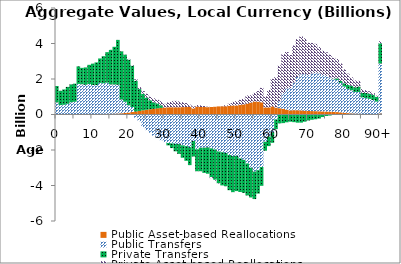
| Category | Public Asset-based Reallocations | Public Transfers | Private Transfers | Private Asset-based Reallocations |
|---|---|---|---|---|
| 0 | 21.534 | 661.137 | 924.591 | 1.373 |
|  | 21.251 | 509.418 | 806.217 | 1.067 |
| 2 | 21.518 | 525.572 | 863.68 | 1.948 |
| 3 | 21.71 | 580.158 | 953.036 | 0.537 |
| 4 | 22.199 | 668.756 | 1005.53 | -0.608 |
| 5 | 23.006 | 694.475 | 1019.086 | 0.857 |
| 6 | 24.775 | 1698.853 | 988.435 | 1.699 |
| 7 | 26.313 | 1678.239 | 923.982 | 1.572 |
| 8 | 27.889 | 1644.93 | 979.219 | 1.307 |
| 9 | 29.864 | 1687.464 | 1081.787 | 1.569 |
| 10 | 31.403 | 1629.53 | 1203.29 | 2.027 |
| 11 | 32.576 | 1622.227 | 1279.365 | 1.743 |
| 12 | 34.959 | 1744.107 | 1378.414 | 1.214 |
| 13 | 36.949 | 1723.667 | 1525.289 | 1.789 |
| 14 | 39.973 | 1750.208 | 1722.781 | 2.206 |
| 15 | 43.158 | 1649.48 | 1946.299 | 7.131 |
| 16 | 47.27 | 1643.293 | 2123.561 | -0.79 |
| 17 | 54.989 | 1618.747 | 2530.279 | 1.289 |
| 18 | 67.769 | 776.37 | 2714.487 | -10.556 |
| 19 | 86.2 | 629.948 | 2655.954 | 11.236 |
| 20 | 109.923 | 412.832 | 2572.945 | 36.077 |
| 21 | 139.126 | 282.162 | 2330.285 | 35.031 |
| 22 | 167.556 | -183.055 | 1737.439 | 78.953 |
| 23 | 199.322 | -376.253 | 1233.686 | 107.375 |
| 24 | 238.115 | -700.46 | 929.459 | 152.57 |
| 25 | 268.229 | -880.323 | 686.528 | 215.221 |
| 26 | 298.25 | -1029.943 | 499.196 | 209.603 |
| 27 | 319.861 | -1191.339 | 371.043 | 218.405 |
| 28 | 345.83 | -1329.432 | 276.843 | 202.805 |
| 29 | 370.123 | -1443.804 | 151.765 | 234.588 |
| 30 | 395.143 | -1553.788 | -1.116 | 207.496 |
| 31 | 406.623 | -1606.328 | -133.325 | 273.48 |
| 32 | 408.394 | -1632.957 | -258.574 | 343.931 |
| 33 | 408.625 | -1654.899 | -419.931 | 359.112 |
| 34 | 406.781 | -1664.095 | -554.344 | 334.778 |
| 35 | 415.903 | -1738.615 | -698.521 | 279.324 |
| 36 | 420.587 | -1781.206 | -828.258 | 224.857 |
| 37 | 430.308 | -1840.096 | -1012.002 | 124.039 |
| 38 | 344.214 | -1489.353 | -878.435 | 113.302 |
| 39 | 444.85 | -1958.298 | -1238.977 | 88.578 |
| 40 | 424.065 | -1872.649 | -1323.598 | 91.343 |
| 41 | 420.801 | -1868.884 | -1420.1 | 55.849 |
| 42 | 414.319 | -1851.398 | -1485.097 | 25.681 |
| 43 | 421.97 | -1905.202 | -1623.69 | -55.47 |
| 44 | 434.982 | -1972.049 | -1705.368 | -53.677 |
| 45 | 456.096 | -2085.197 | -1789.879 | -25.52 |
| 46 | 459.897 | -2124.636 | -1871.002 | 11.174 |
| 47 | 464.458 | -2167.608 | -1874.304 | 56.657 |
| 48 | 491.367 | -2280.564 | -1984.691 | 114.82 |
| 49 | 507.812 | -2338.024 | -2037.074 | 204.733 |
| 50 | 509.429 | -2328.3 | -1986.629 | 242.391 |
| 51 | 544.685 | -2474.061 | -1893.236 | 280.697 |
| 52 | 569.576 | -2554.784 | -1860.21 | 320.029 |
| 53 | 615.34 | -2757.915 | -1802.533 | 456.612 |
| 54 | 671.875 | -3003.235 | -1670.813 | 412.783 |
| 55 | 729.942 | -3217.867 | -1546.973 | 488.478 |
| 56 | 722.961 | -3137.615 | -1317.407 | 598.572 |
| 57 | 687.925 | -2958.751 | -1059.188 | 813.623 |
| 58 | 399.497 | -1534.628 | -506.09 | 623.853 |
| 59 | 399.36 | -1246.019 | -534.048 | 980.747 |
| 60 | 454.937 | -995.654 | -598.913 | 1554.137 |
| 61 | 388.832 | -279.517 | -542.239 | 1720.549 |
| 62 | 354.025 | 391.44 | -500.713 | 2024.469 |
| 63 | 320.197 | 886.822 | -484.409 | 2194.865 |
| 64 | 274.366 | 1200.846 | -440.144 | 2044.47 |
| 65 | 233.554 | 1256.295 | -404.227 | 1863.166 |
| 66 | 243.036 | 1560.207 | -430.969 | 2086.089 |
| 67 | 240.2 | 1873.566 | -460.202 | 2133.295 |
| 68 | 232.478 | 2033.204 | -458.271 | 2131.245 |
| 69 | 215.458 | 2056.859 | -405.353 | 2020.674 |
| 70 | 199.027 | 2025.363 | -337.708 | 1814.693 |
| 71 | 194.052 | 2120.143 | -296.326 | 1718.411 |
| 72 | 187.626 | 2146.702 | -269.611 | 1648.728 |
| 73 | 182.272 | 2139.926 | -230.022 | 1479.823 |
| 74 | 174.148 | 2054.95 | -143.418 | 1363.098 |
| 75 | 166.465 | 2011.87 | -86.207 | 1325.447 |
| 76 | 162.792 | 1933.5 | -59.431 | 1273.804 |
| 77 | 152.127 | 1837.411 | 31.432 | 1176.848 |
| 78 | 136.863 | 1802.134 | 96.5 | 1093.256 |
| 79 | 120.295 | 1657.043 | 114.831 | 982.037 |
| 80 | 94.208 | 1485.53 | 180.056 | 785.328 |
| 81 | 76.399 | 1366.64 | 219.126 | 640.964 |
| 82 | 61.697 | 1303.372 | 254.188 | 474.514 |
| 83 | 51.809 | 1217.788 | 269.578 | 380.9 |
| 84 | 44.66 | 1225.492 | 304.774 | 324.956 |
| 85 | 33.4 | 933.439 | 257.088 | 208.777 |
| 86 | 29.466 | 894.545 | 287.066 | 160.883 |
| 87 | 26.687 | 853.754 | 297.8 | 132.127 |
| 88 | 21.832 | 798.319 | 287.2 | 103.355 |
| 89 | 17.232 | 712.128 | 272.614 | 60.433 |
| 90+ | 59.834 | 2811.24 | 1136.153 | 122.574 |